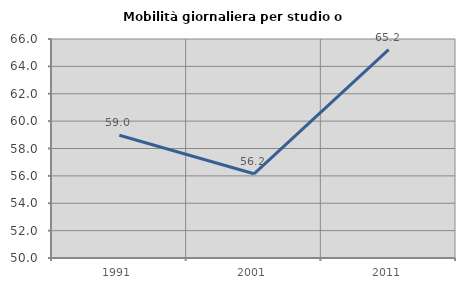
| Category | Mobilità giornaliera per studio o lavoro |
|---|---|
| 1991.0 | 58.963 |
| 2001.0 | 56.151 |
| 2011.0 | 65.217 |